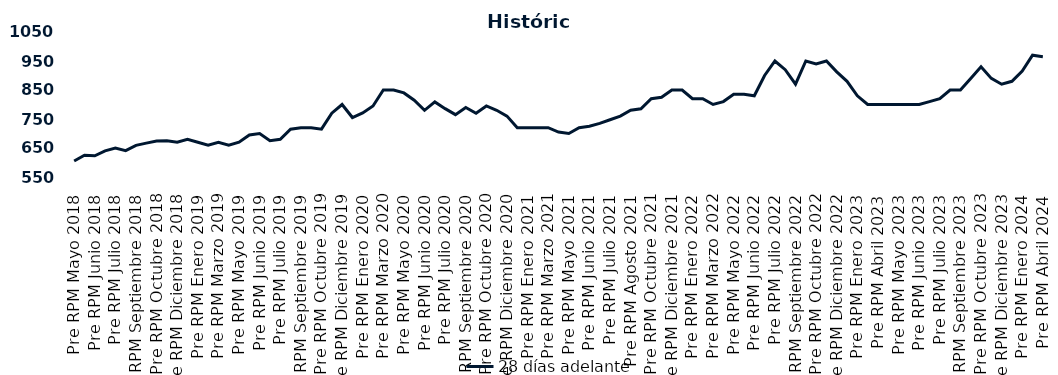
| Category | 28 días adelante |
|---|---|
| Pre RPM Mayo 2018 | 605 |
| Post RPM Mayo 2018 | 625 |
| Pre RPM Junio 2018 | 623 |
| Post RPM Junio 2018 | 640 |
| Pre RPM Julio 2018 | 650 |
| Post RPM Julio 2018 | 641 |
| Pre RPM Septiembre 2018 | 659 |
| Post RPM Septiembre 2018 | 666.75 |
| Pre RPM Octubre 2018 | 674 |
| Post RPM Octubre 2018 | 675 |
| Pre RPM Diciembre 2018 | 670 |
| Post RPM Diciembre 2018 | 680 |
| Pre RPM Enero 2019 | 670 |
| Post RPM Enero 2019 | 660 |
| Pre RPM Marzo 2019 | 670 |
| Post RPM Marzo 2019 | 660 |
| Pre RPM Mayo 2019 | 670 |
| Post RPM Mayo 2019 | 695 |
| Pre RPM Junio 2019 | 700 |
| Post RPM Junio 2019 | 675 |
| Pre RPM Julio 2019 | 680 |
| Post RPM Julio 2019 | 715 |
| Pre RPM Septiembre 2019 | 720 |
| Post RPM Septiembre 2019 | 720 |
| Pre RPM Octubre 2019 | 715 |
| Post RPM Octubre 2019 | 770 |
| Pre RPM Diciembre 2019 | 800 |
| Post RPM Diciembre 2019 | 755 |
| Pre RPM Enero 2020 | 771 |
| Post RPM Enero 2020 | 795 |
| Pre RPM Marzo 2020 | 850 |
| Post RPM Marzo 2020 | 850 |
| Pre RPM Mayo 2020 | 840 |
| Post RPM Mayo 2020 | 815 |
| Pre RPM Junio 2020 | 780 |
| Post RPM Junio 2020 | 809 |
| Pre RPM Julio 2020 | 785.72 |
| Post RPM Julio 2020 | 765 |
| Pre RPM Septiembre 2020 | 790 |
| Post RPM Septiembre 2020 | 770 |
| Pre RPM Octubre 2020 | 795 |
| Post RPM Octubre 2020 | 780 |
| Pre RPM Diciembre 2020 | 760 |
| Post RPM Diciembre 2020 | 720 |
| Pre RPM Enero 2021 | 720 |
| Post RPM Enero 2021 | 720 |
| Pre RPM Marzo 2021 | 720 |
| Post RPM Marzo 2021 | 705 |
| Pre RPM Mayo 2021 | 700 |
| Post RPM Mayo 2021 | 720 |
| Pre RPM Junio 2021 | 725 |
| Post RPM Junio 2021 | 735 |
| Pre RPM Julio 2021 | 747.5 |
| Post RPM Julio 2021 | 760 |
| Pre RPM Agosto 2021 | 780 |
| Post RPM Agosto 2021 | 785 |
| Pre RPM Octubre 2021 | 820 |
| Post RPM Octubre 2021 | 825 |
| Pre RPM Diciembre 2021 | 850 |
| Post RPM Diciembre 2021 | 850 |
| Pre RPM Enero 2022 | 820 |
| Post RPM Enero 2022 | 820 |
| Pre RPM Marzo 2022 | 800 |
| Post RPM Marzo 2022 | 810 |
| Pre RPM Mayo 2022 | 835 |
| Post RPM Mayo 2022 | 835 |
| Pre RPM Junio 2022 | 830 |
| Post RPM Junio 2022 | 900 |
| Pre RPM Julio 2022 | 950 |
| Post RPM Julio 2022 | 920 |
| Pre RPM Septiembre 2022 | 870 |
| Post RPM Septiembre 2022 | 950 |
| Pre RPM Octubre 2022 | 940 |
| Post RPM Octubre 2022 | 950 |
| Pre RPM Diciembre 2022 | 912.5 |
| Post RPM Diciembre 2022 | 880 |
| Pre RPM Enero 2023 | 830 |
| Post RPM Enero 2023 | 800 |
| Pre RPM Abril 2023 | 800 |
| Post RPM Abril 2023 | 800 |
| Pre RPM Mayo 2023 | 800 |
| Post RPM Mayo 2023 | 800 |
| Pre RPM Junio 2023 | 800 |
| Post RPM Junio 2023 | 810 |
| Pre RPM Julio 2023 | 820 |
| Post RPM Julio 2023 | 850 |
| Pre RPM Septiembre 2023 | 850 |
| Post RPM Septiembre 2023 | 890 |
| Pre RPM Octubre 2023 | 930 |
| Post RPM Octubre 2023 | 890 |
| Pre RPM Diciembre 2023 | 870 |
| Post RPM Diciembre 2023 | 880 |
| Pre RPM Enero 2024 | 915 |
| Post RPM Enero 2024 | 970 |
| Pre RPM Abril 2024 | 965 |